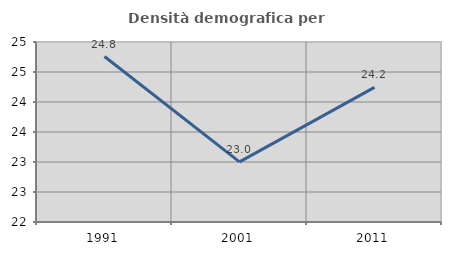
| Category | Densità demografica |
|---|---|
| 1991.0 | 24.758 |
| 2001.0 | 23.002 |
| 2011.0 | 24.243 |